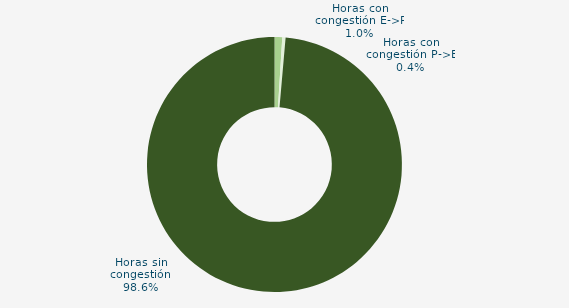
| Category | Horas con congestión E->P |
|---|---|
| Horas con congestión E->P | 0.972 |
| Horas con congestión P->E | 0.417 |
| Horas sin congestión | 98.611 |